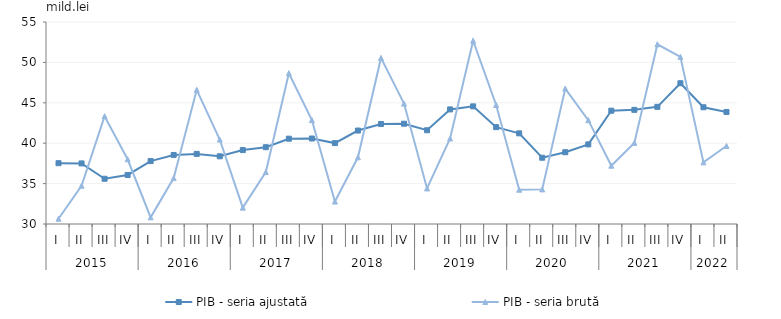
| Category | PIB - seria ajustată | PIB - seria brută |
|---|---|---|
| 0 | 37.527 | 30.647 |
| 1 | 37.498 | 34.736 |
| 2 | 35.599 | 43.347 |
| 3 | 36.069 | 38.011 |
| 4 | 37.788 | 30.82 |
| 5 | 38.544 | 35.681 |
| 6 | 38.678 | 46.605 |
| 7 | 38.379 | 40.451 |
| 8 | 39.147 | 32.024 |
| 9 | 39.504 | 36.429 |
| 10 | 40.557 | 48.654 |
| 11 | 40.581 | 42.863 |
| 12 | 40.012 | 32.776 |
| 13 | 41.566 | 38.257 |
| 14 | 42.379 | 50.555 |
| 15 | 42.412 | 44.902 |
| 16 | 41.602 | 34.401 |
| 17 | 44.181 | 40.587 |
| 18 | 44.559 | 52.682 |
| 19 | 41.988 | 44.734 |
| 20 | 41.218 | 34.239 |
| 21 | 38.201 | 34.285 |
| 22 | 38.883 | 46.761 |
| 23 | 39.851 | 42.851 |
| 24 | 44.024 | 37.215 |
| 25 | 44.128 | 40.039 |
| 26 | 44.501 | 52.243 |
| 27 | 47.422 | 50.69 |
| 28 | 44.448 | 37.628 |
| 29 | 43.867 | 39.66 |